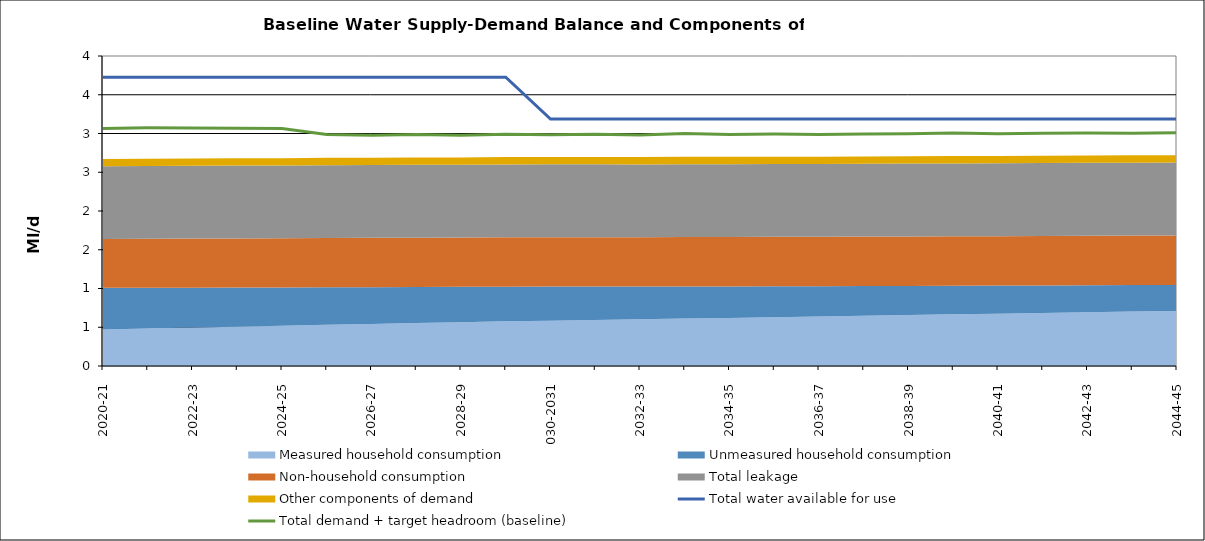
| Category | Total water available for use | Total demand + target headroom (baseline) |
|---|---|---|
| 0 | 3.726 | 3.065 |
| 1 | 3.726 | 3.073 |
| 2 | 3.726 | 3.071 |
| 3 | 3.726 | 3.068 |
| 4 | 3.726 | 3.064 |
| 5 | 3.726 | 2.986 |
| 6 | 3.726 | 2.977 |
| 7 | 3.726 | 2.988 |
| 8 | 3.726 | 2.978 |
| 9 | 3.726 | 2.992 |
| 10 | 3.186 | 2.983 |
| 11 | 3.186 | 2.991 |
| 12 | 3.186 | 2.981 |
| 13 | 3.186 | 2.999 |
| 14 | 3.186 | 2.987 |
| 15 | 3.186 | 2.993 |
| 16 | 3.186 | 2.987 |
| 17 | 3.186 | 2.995 |
| 18 | 3.186 | 2.998 |
| 19 | 3.186 | 3.007 |
| 20 | 3.186 | 2.996 |
| 21 | 3.186 | 3.005 |
| 22 | 3.186 | 3.007 |
| 23 | 3.186 | 3.004 |
| 24 | 3.186 | 3.008 |